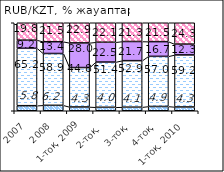
| Category | оң | әсер етпеді | теріс | білмеймін |
|---|---|---|---|---|
| 2007 | 5.755 | 65.222 | 9.24 | 19.785 |
| 2008 | 6.178 | 58.883 | 13.4 | 21.537 |
| 1-тоқ. 2009 | 4.3 | 44.8 | 28.01 | 22.89 |
| 2-тоқ.  | 3.95 | 51.4 | 22.52 | 22.13 |
| 3-тоқ. | 4.07 | 52.87 | 21.74 | 21.32 |
| 4-тоқ. | 4.87 | 56.95 | 16.71 | 21.48 |
| 1-тоқ. 2010  | 4.3 | 59.15 | 12.27 | 24.28 |